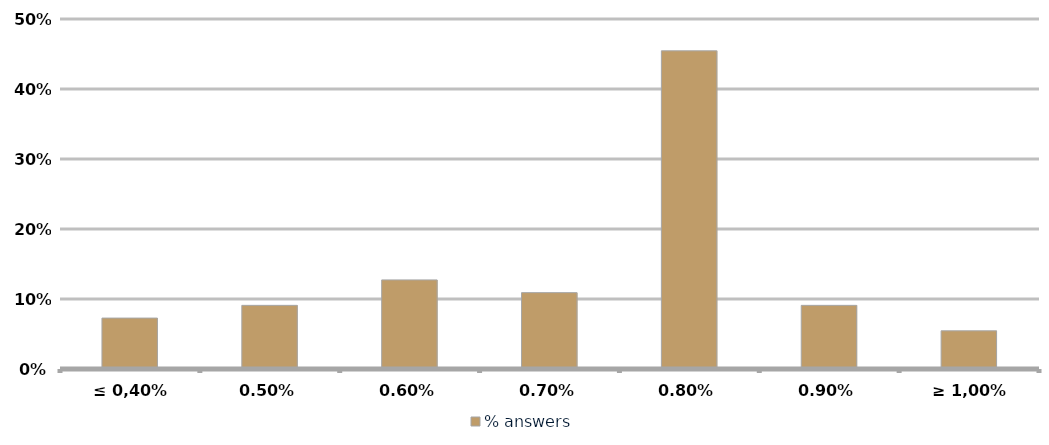
| Category | % answers |
|---|---|
| ≤ 0,40% | 0.073 |
| 0,50% | 0.091 |
| 0,60% | 0.127 |
| 0,70% | 0.109 |
| 0,80% | 0.455 |
| 0,90% | 0.091 |
| ≥ 1,00% | 0.055 |